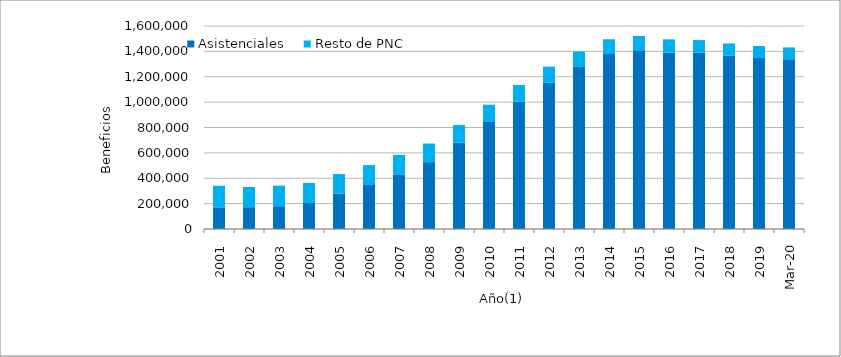
| Category | Asistenciales | Resto de PNC |
|---|---|---|
| 2001.0 | 170688 | 170158.667 |
| 2002.0 | 171790.333 | 159761.5 |
| 2003.0 | 179461.667 | 161912.083 |
| 2004.0 | 204383.083 | 158321 |
| 2005.0 | 278885.417 | 154252.083 |
| 2006.0 | 347223.417 | 156271.5 |
| 2007.0 | 430746.75 | 153351.75 |
| 2008.0 | 526977.833 | 146564.333 |
| 2009.0 | 678683.917 | 140651.833 |
| 2010.0 | 843221.583 | 136730.5 |
| 2011.0 | 1002631.083 | 132117 |
| 2012.0 | 1151713.083 | 127630.167 |
| 2013.0 | 1277481.583 | 121703.5 |
| 2014.0 | 1378747.333 | 116622.583 |
| 2015.0 | 1409011.917 | 112673.25 |
| 2016.0 | 1390872.417 | 104039 |
| 2017.0 | 1390559.917 | 98299.917 |
| 2018.0 | 1365207.167 | 97199.75 |
| 2019.0 | 1346815.083 | 95435.833 |
| 43891.0 | 1338375 | 92814 |